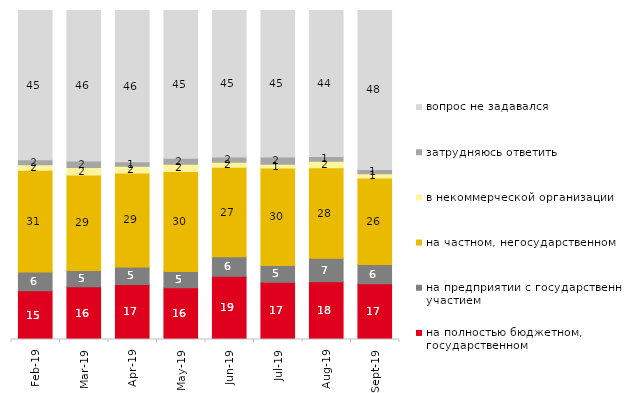
| Category | на полностью бюджетном, государственном | на предприятии с государственным участием | на частном, негосударственном | в некоммерческой организации | затрудняюсь ответить | вопрос не задавался |
|---|---|---|---|---|---|---|
| 2019-02-01 | 14.85 | 5.7 | 30.9 | 1.65 | 1.55 | 45.35 |
| 2019-03-01 | 16.062 | 4.923 | 29.04 | 2.287 | 1.939 | 45.748 |
| 2019-04-01 | 16.733 | 5.297 | 28.614 | 1.98 | 1.436 | 45.941 |
| 2019-05-01 | 15.701 | 5.002 | 30.362 | 2.179 | 1.882 | 44.874 |
| 2019-06-01 | 19.202 | 5.985 | 27.132 | 1.546 | 1.596 | 44.539 |
| 2019-07-01 | 17.426 | 5.099 | 29.604 | 1.139 | 2.228 | 44.505 |
| 2019-08-01 | 17.532 | 7.143 | 27.522 | 1.948 | 1.449 | 44.406 |
| 2019-09-01 | 16.931 | 5.842 | 26.287 | 1.287 | 1.337 | 48.317 |